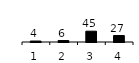
| Category | Series 0 |
|---|---|
| 1.0 | 4 |
| 2.0 | 6 |
| 3.0 | 45 |
| 4.0 | 27 |